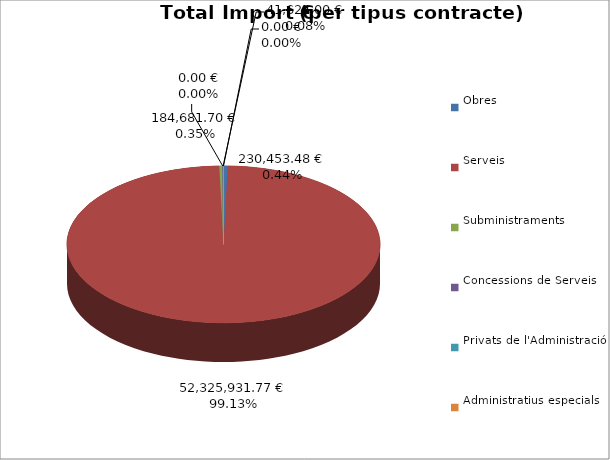
| Category | Total preu
(amb IVA) |
|---|---|
| Obres | 230453.48 |
| Serveis | 52325931.77 |
| Subministraments | 184681.7 |
| Concessions de Serveis | 0 |
| Privats de l'Administració | 41624 |
| Administratius especials | 0 |